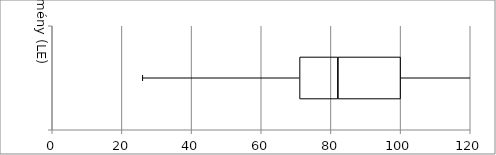
| Category |   | Series 2 |
|---|---|---|
| 0 | 11 | 18 |